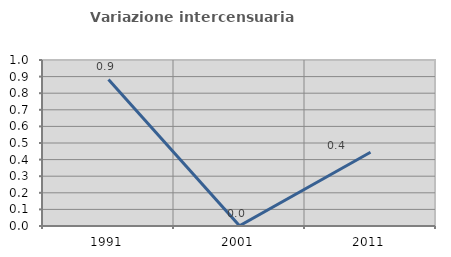
| Category | Variazione intercensuaria annua |
|---|---|
| 1991.0 | 0.883 |
| 2001.0 | 0.001 |
| 2011.0 | 0.444 |